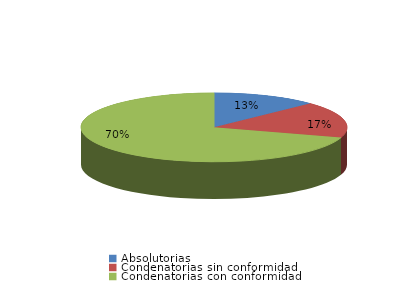
| Category | Series 0 |
|---|---|
| Absolutorias | 186 |
| Condenatorias sin conformidad | 247 |
| Condenatorias con conformidad | 1020 |